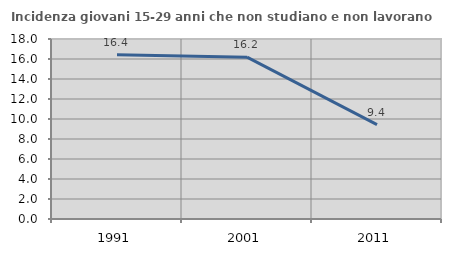
| Category | Incidenza giovani 15-29 anni che non studiano e non lavorano  |
|---|---|
| 1991.0 | 16.418 |
| 2001.0 | 16.186 |
| 2011.0 | 9.446 |